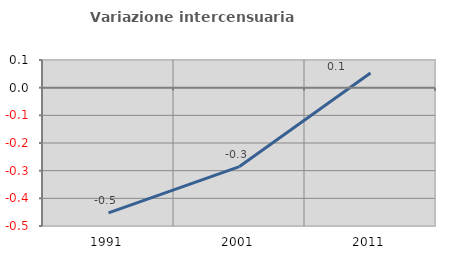
| Category | Variazione intercensuaria annua |
|---|---|
| 1991.0 | -0.453 |
| 2001.0 | -0.285 |
| 2011.0 | 0.053 |